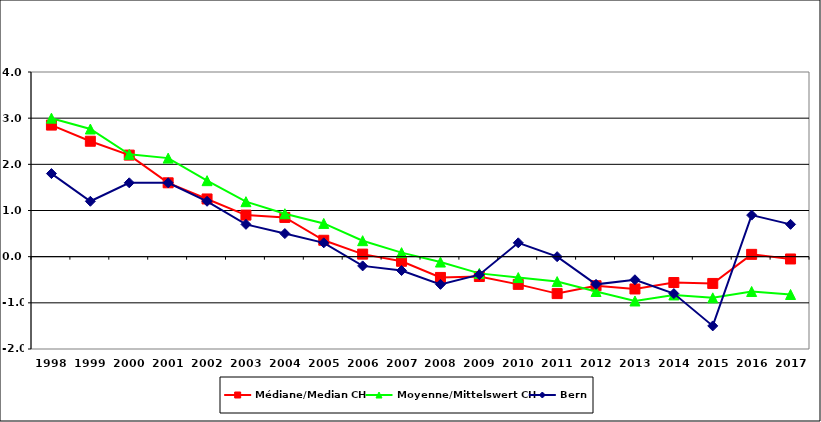
| Category | Médiane/Median CH | Moyenne/Mittelswert CH | Bern |
|---|---|---|---|
| 1998.0 | 2.85 | 3 | 1.8 |
| 1999.0 | 2.5 | 2.765 | 1.2 |
| 2000.0 | 2.2 | 2.216 | 1.6 |
| 2001.0 | 1.6 | 2.135 | 1.6 |
| 2002.0 | 1.25 | 1.646 | 1.2 |
| 2003.0 | 0.9 | 1.191 | 0.7 |
| 2004.0 | 0.85 | 0.93 | 0.5 |
| 2005.0 | 0.355 | 0.72 | 0.3 |
| 2006.0 | 0.055 | 0.346 | -0.2 |
| 2007.0 | -0.1 | 0.087 | -0.3 |
| 2008.0 | -0.45 | -0.117 | -0.6 |
| 2009.0 | -0.43 | -0.362 | -0.39 |
| 2010.0 | -0.6 | -0.453 | 0.3 |
| 2011.0 | -0.8 | -0.54 | 0 |
| 2012.0 | -0.63 | -0.754 | -0.6 |
| 2013.0 | -0.7 | -0.96 | -0.5 |
| 2014.0 | -0.56 | -0.829 | -0.8 |
| 2015.0 | -0.58 | -0.892 | -1.5 |
| 2016.0 | 0.05 | -0.754 | 0.9 |
| 2017.0 | -0.05 | -0.819 | 0.7 |